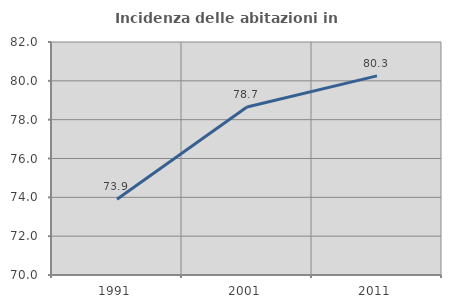
| Category | Incidenza delle abitazioni in proprietà  |
|---|---|
| 1991.0 | 73.906 |
| 2001.0 | 78.654 |
| 2011.0 | 80.257 |